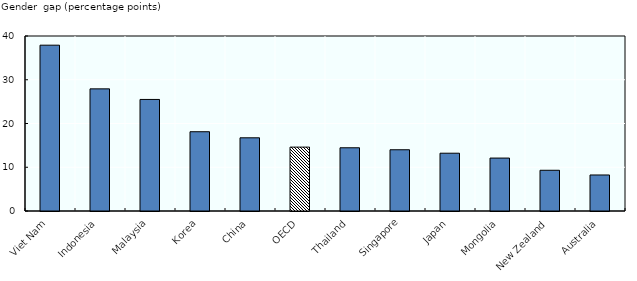
| Category | Series 1 |
|---|---|
| Viet Nam | 37.9 |
| Indonesia | 27.918 |
| Malaysia | 25.5 |
| Korea | 18.12 |
| China | 16.73 |
| OECD | 14.602 |
| Thailand | 14.451 |
| Singapore | 14 |
| Japan | 13.21 |
| Mongolia | 12.1 |
| New Zealand | 9.308 |
| Australia | 8.234 |